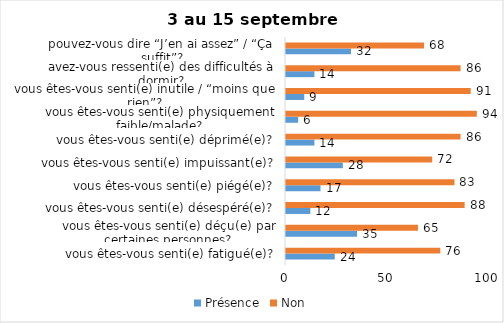
| Category | Présence | Non |
|---|---|---|
| vous êtes-vous senti(e) fatigué(e)? | 24 | 76 |
| vous êtes-vous senti(e) déçu(e) par certaines personnes? | 35 | 65 |
| vous êtes-vous senti(e) désespéré(e)? | 12 | 88 |
| vous êtes-vous senti(e) piégé(e)? | 17 | 83 |
| vous êtes-vous senti(e) impuissant(e)? | 28 | 72 |
| vous êtes-vous senti(e) déprimé(e)? | 14 | 86 |
| vous êtes-vous senti(e) physiquement faible/malade? | 6 | 94 |
| vous êtes-vous senti(e) inutile / “moins que rien”? | 9 | 91 |
| avez-vous ressenti(e) des difficultés à dormir? | 14 | 86 |
| pouvez-vous dire “J’en ai assez” / “Ça suffit”? | 32 | 68 |